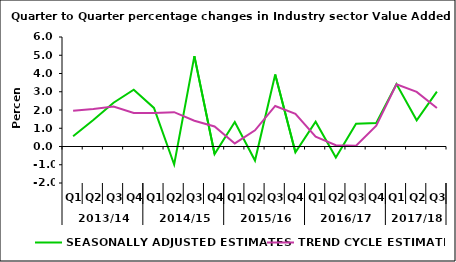
| Category | SEASONALLY ADJUSTED ESTIMATES | TREND CYCLE ESTIMATES |
|---|---|---|
| 0 | 0.565 | 1.953 |
| 1 | 1.452 | 2.051 |
| 2 | 2.4 | 2.195 |
| 3 | 3.112 | 1.841 |
| 4 | 2.114 | 1.835 |
| 5 | -0.985 | 1.882 |
| 6 | 4.951 | 1.414 |
| 7 | -0.413 | 1.1 |
| 8 | 1.34 | 0.169 |
| 9 | -0.769 | 0.889 |
| 10 | 3.946 | 2.22 |
| 11 | -0.32 | 1.794 |
| 12 | 1.359 | 0.542 |
| 13 | -0.602 | 0.068 |
| 14 | 1.247 | 0.045 |
| 15 | 1.29 | 1.139 |
| 16 | 3.418 | 3.413 |
| 17 | 1.432 | 2.99 |
| 18 | 3.004 | 2.107 |